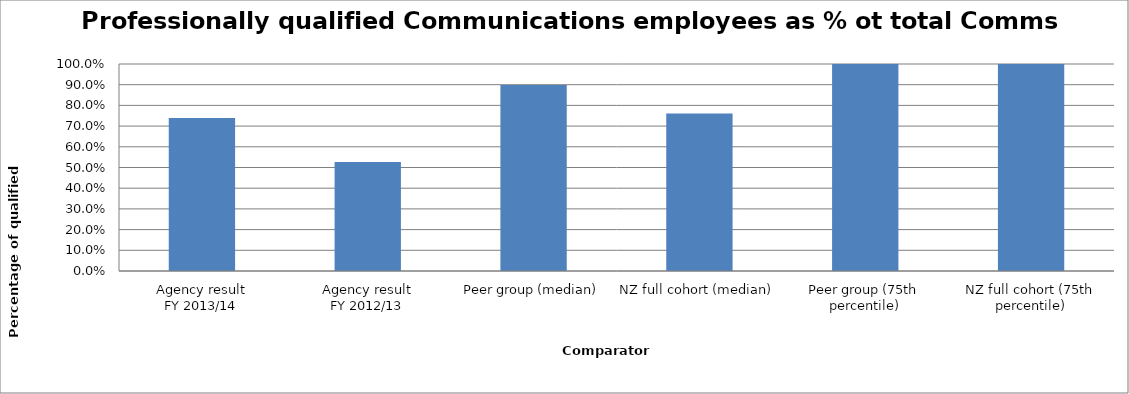
| Category | Result |
|---|---|
| Agency result
FY 2013/14 | 0.739 |
| Agency result
FY 2012/13 | 0.526 |
| Peer group (median) | 0.899 |
| NZ full cohort (median) | 0.761 |
| Peer group (75th percentile) | 1 |
| NZ full cohort (75th percentile) | 1 |